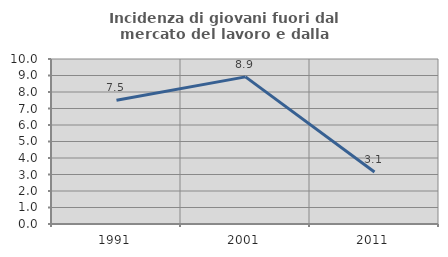
| Category | Incidenza di giovani fuori dal mercato del lavoro e dalla formazione  |
|---|---|
| 1991.0 | 7.5 |
| 2001.0 | 8.917 |
| 2011.0 | 3.15 |